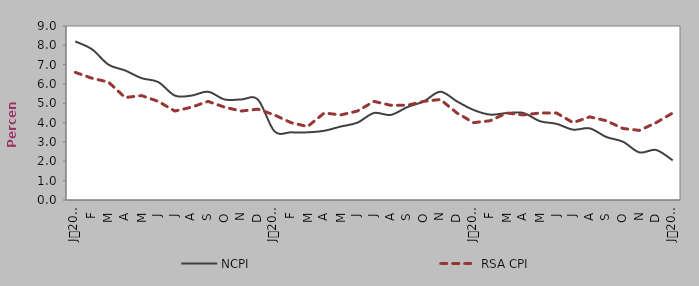
| Category | NCPI | RSA CPI |
|---|---|---|
| 0 | 8.2 | 6.6 |
| 1900-01-01 | 7.8 | 6.3 |
| 1900-01-02 | 7 | 6.1 |
| 1900-01-03 | 6.7 | 5.3 |
| 1900-01-04 | 6.3 | 5.4 |
| 1900-01-05 | 6.1 | 5.1 |
| 1900-01-06 | 5.4 | 4.6 |
| 1900-01-07 | 5.4 | 4.8 |
| 1900-01-08 | 5.6 | 5.1 |
| 1900-01-09 | 5.2 | 4.8 |
| 1900-01-10 | 5.2 | 4.6 |
| 1900-01-11 | 5.2 | 4.7 |
| 1900-01-12 | 3.555 | 4.4 |
| 1900-01-13 | 3.5 | 4 |
| 1900-01-14 | 3.5 | 3.8 |
| 1900-01-15 | 3.581 | 4.5 |
| 1900-01-16 | 3.8 | 4.4 |
| 1900-01-17 | 4 | 4.6 |
| 1900-01-18 | 4.5 | 5.1 |
| 1900-01-19 | 4.4 | 4.9 |
| 1900-01-20 | 4.8 | 4.9 |
| 1900-01-21 | 5.1 | 5.1 |
| 1900-01-22 | 5.6 | 5.2 |
| 1900-01-23 | 5.1 | 4.5 |
| 1900-01-24 | 4.658 | 4 |
| 1900-01-25 | 4.416 | 4.1 |
| 1900-01-26 | 4.498 | 4.5 |
| 1900-01-27 | 4.503 | 4.4 |
| 1900-01-28 | 4.076 | 4.5 |
| 1900-01-29 | 3.939 | 4.5 |
| 1900-01-30 | 3.639 | 4 |
| 1900-01-31 | 3.705 | 4.3 |
| 1900-02-01 | 3.259 | 4.1 |
| 1900-02-02 | 3.015 | 3.7 |
| 1900-02-03 | 2.461 | 3.6 |
| 1900-02-04 | 2.588 | 4 |
| 1900-02-05 | 2.05 | 4.5 |